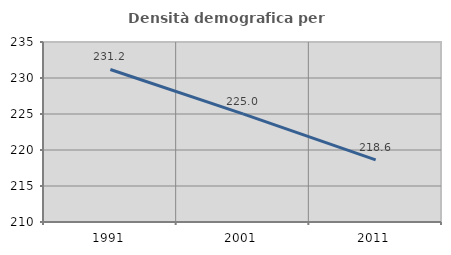
| Category | Densità demografica |
|---|---|
| 1991.0 | 231.186 |
| 2001.0 | 225.028 |
| 2011.0 | 218.617 |